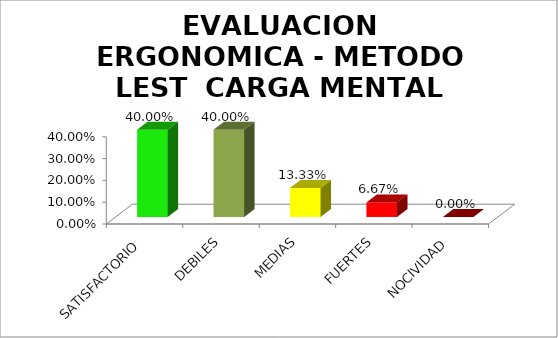
| Category | EVALUACION ERGONOMICA - METODO LEST  |
|---|---|
| SATISFACTORIO | 0.4 |
| DEBILES | 0.4 |
| MEDIAS | 0.133 |
| FUERTES | 0.067 |
| NOCIVIDAD | 0 |